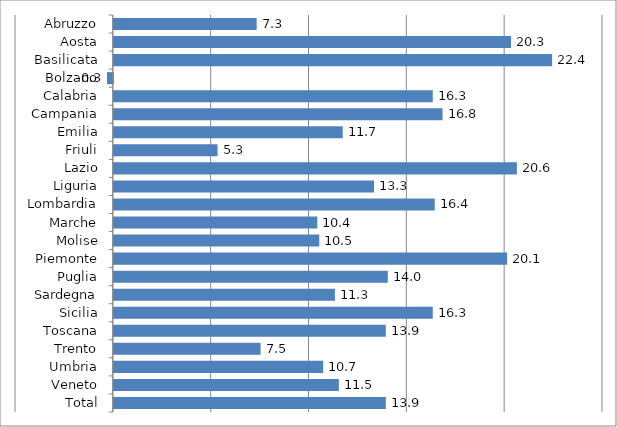
| Category | Series 0 |
|---|---|
| Abruzzo | 7.3 |
| Aosta | 20.3 |
| Basilicata | 22.4 |
| Bolzano | -0.3 |
| Calabria | 16.3 |
| Campania | 16.8 |
| Emilia | 11.7 |
| Friuli | 5.3 |
| Lazio | 20.6 |
| Liguria | 13.3 |
| Lombardia | 16.4 |
| Marche | 10.4 |
| Molise | 10.5 |
| Piemonte | 20.1 |
| Puglia | 14 |
| Sardegna | 11.3 |
| Sicilia | 16.3 |
| Toscana | 13.9 |
| Trento | 7.5 |
| Umbria | 10.7 |
| Veneto | 11.5 |
| Total | 13.9 |